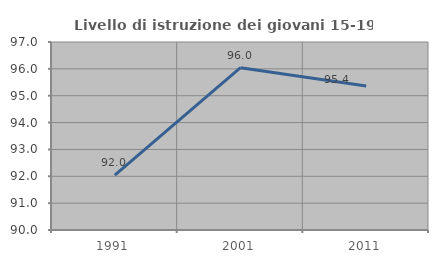
| Category | Livello di istruzione dei giovani 15-19 anni |
|---|---|
| 1991.0 | 92.041 |
| 2001.0 | 96.042 |
| 2011.0 | 95.361 |